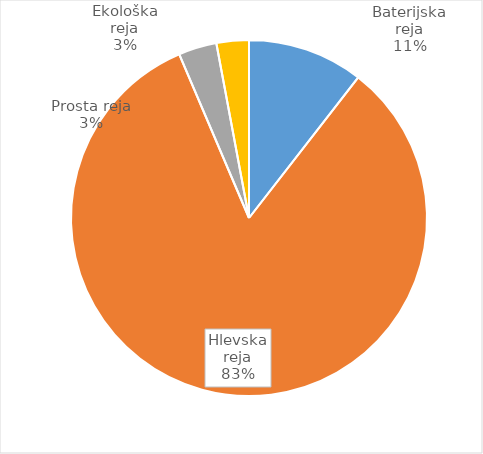
| Category | Količina kosov jajc |
|---|---|
| Baterijska reja | 266323 |
| Hlevska reja | 2103982 |
| Prosta reja | 87837 |
| Ekološka reja | 74520 |